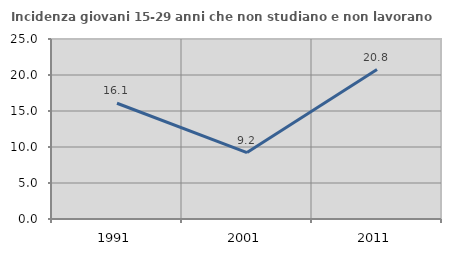
| Category | Incidenza giovani 15-29 anni che non studiano e non lavorano  |
|---|---|
| 1991.0 | 16.078 |
| 2001.0 | 9.231 |
| 2011.0 | 20.755 |